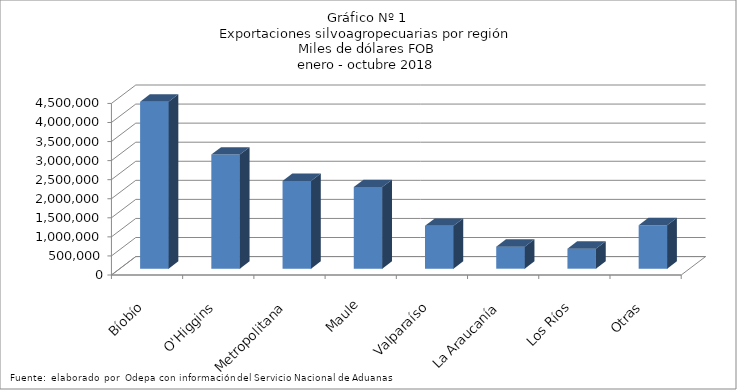
| Category | Series 0 |
|---|---|
| Bíobío | 4380494.134 |
| O'Higgins | 2994387.402 |
| Metropolitana | 2301689.699 |
| Maule | 2140437.405 |
| Valparaíso | 1125330.079 |
| La Araucanía | 577686 |
| Los Ríos | 524392.705 |
| Otras | 1141129.756 |